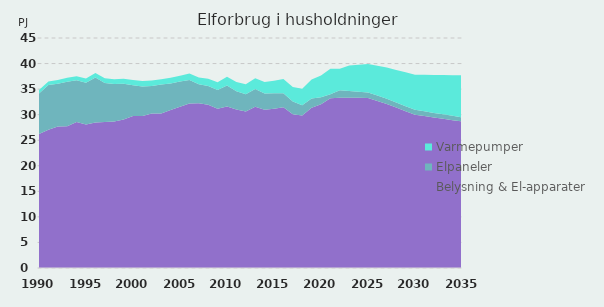
| Category | Belysning & El-apparater | Elpaneler | Varmepumper |
|---|---|---|---|
| 1990 | 26.24 | 7.89 | 0.69 |
| 1991 | 27.04 | 8.77 | 0.67 |
| 1992 | 27.7 | 8.35 | 0.71 |
| 1993 | 27.71 | 8.72 | 0.77 |
| 1994 | 28.58 | 8.16 | 0.8 |
| 1995 | 28.09 | 8.14 | 0.83 |
| 1996 | 28.49 | 8.78 | 0.87 |
| 1997 | 28.55 | 7.67 | 0.91 |
| 1998 | 28.67 | 7.32 | 0.96 |
| 1999 | 29.05 | 6.98 | 0.99 |
| 2000 | 29.73 | 6.02 | 1.02 |
| 2001 | 29.73 | 5.8 | 1.04 |
| 2002 | 30.24 | 5.39 | 1.05 |
| 2003 | 30.22 | 5.67 | 1.06 |
| 2004 | 30.93 | 5.19 | 1.08 |
| 2005 | 31.57 | 4.9 | 1.15 |
| 2006 | 32.18 | 4.6 | 1.29 |
| 2007 | 32.24 | 3.73 | 1.28 |
| 2008 | 31.96 | 3.64 | 1.41 |
| 2009 | 31.17 | 3.64 | 1.54 |
| 2010 | 31.62 | 4.11 | 1.68 |
| 2011 | 31.01 | 3.58 | 1.81 |
| 2012 | 30.64 | 3.37 | 1.95 |
| 2013 | 31.55 | 3.46 | 2.1 |
| 2014 | 30.94 | 3.22 | 2.22 |
| 2015 | 31.17 | 3 | 2.47 |
| 2016 | 31.45 | 2.76 | 2.77 |
| 2017 | 30.09 | 2.47 | 2.85 |
| 2018 | 29.82 | 2 | 3.25 |
| 2019 | 31.35 | 1.82 | 3.7 |
| 2020 | 32.04 | 1.38 | 4.26 |
| 2021 | 33.2 | 0.81 | 4.99 |
| 2022 | 33.29 | 1.49 | 4.21 |
| 2023 | 33.31 | 1.31 | 4.98 |
| 2024 | 33.3 | 1.19 | 5.27 |
| 2025 | 33.25 | 1.1 | 5.58 |
| 2026 | 32.67 | 1.07 | 5.84 |
| 2027 | 32.08 | 1.04 | 6.1 |
| 2028 | 31.39 | 1.01 | 6.35 |
| 2029 | 30.69 | 0.98 | 6.61 |
| 2030 | 29.99 | 0.95 | 6.87 |
| 2031 | 29.73 | 0.92 | 7.14 |
| 2032 | 29.46 | 0.89 | 7.41 |
| 2033 | 29.19 | 0.87 | 7.68 |
| 2034 | 28.93 | 0.84 | 7.96 |
| 2035 | 28.66 | 0.81 | 8.23 |